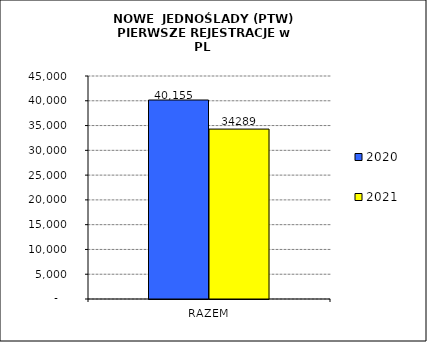
| Category | 2020 | 2021 |
|---|---|---|
| RAZEM | 40155 | 34289 |